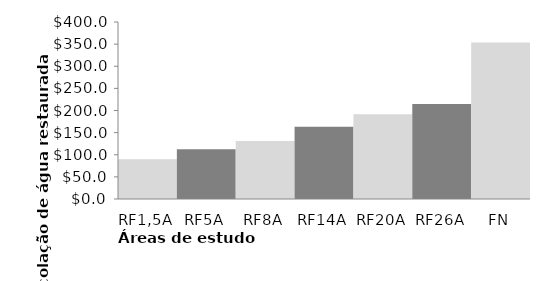
| Category | Series 0 |
|---|---|
| RF1,5A | 90.004 |
| RF5A | 112.658 |
| RF8A | 131.026 |
| RF14A | 163.477 |
| RF20A | 191.641 |
| RF26A | 214.908 |
| FN | 353.894 |